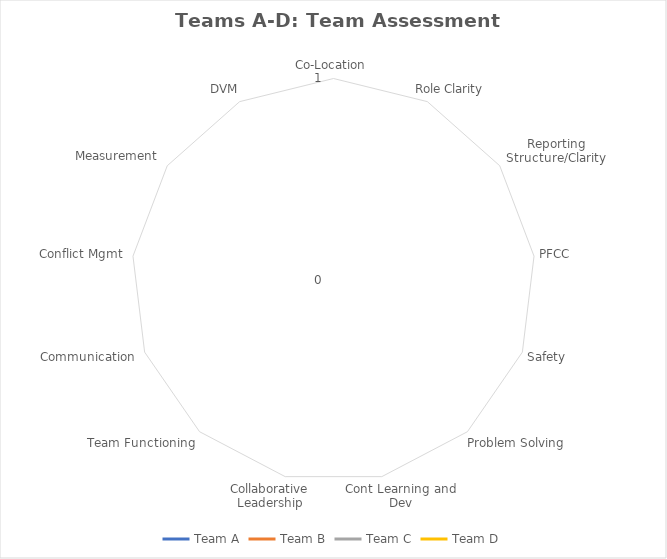
| Category | Team A | Team B | Team C | Team D |
|---|---|---|---|---|
| Co-Location | 0 | 0 | 0 | 0 |
| Role Clarity | 0 | 0 | 0 | 0 |
| Reporting Structure/Clarity | 0 | 0 | 0 | 0 |
| PFCC | 0 | 0 | 0 | 0 |
| Safety | 0 | 0 | 0 | 0 |
| Problem Solving | 0 | 0 | 0 | 0 |
| Cont Learning and Dev | 0 | 0 | 0 | 0 |
| Collaborative Leadership | 0 | 0 | 0 | 0 |
| Team Functioning | 0 | 0 | 0 | 0 |
| Communication | 0 | 0 | 0 | 0 |
| Conflict Mgmt | 0 | 0 | 0 | 0 |
| Measurement | 0 | 0 | 0 | 0 |
| DVM | 0 | 0 | 0 | 0 |